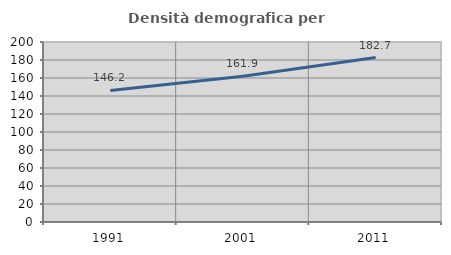
| Category | Densità demografica |
|---|---|
| 1991.0 | 146.23 |
| 2001.0 | 161.85 |
| 2011.0 | 182.693 |